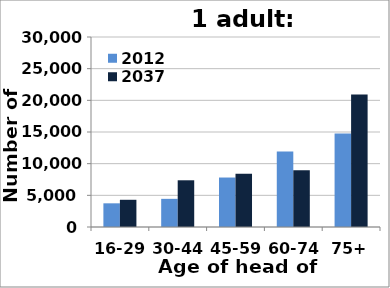
| Category | 2012 | 2037 |
|---|---|---|
| 16-29 | 3739 | 4297 |
| 30-44 | 4446 | 7376 |
| 45-59 | 7812 | 8425 |
| 60-74 | 11917 | 8959 |
| 75+ | 14780 | 20922 |